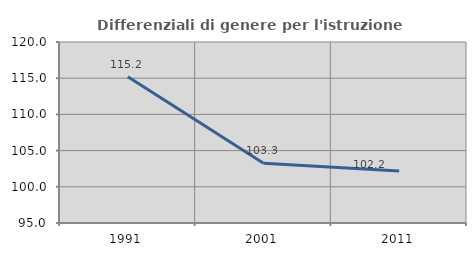
| Category | Differenziali di genere per l'istruzione superiore |
|---|---|
| 1991.0 | 115.212 |
| 2001.0 | 103.262 |
| 2011.0 | 102.181 |